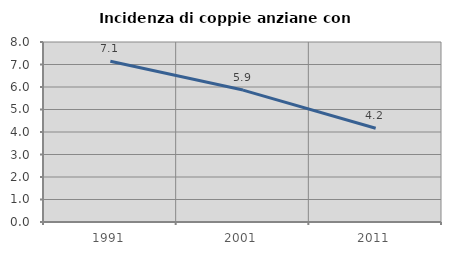
| Category | Incidenza di coppie anziane con figli |
|---|---|
| 1991.0 | 7.143 |
| 2001.0 | 5.863 |
| 2011.0 | 4.167 |